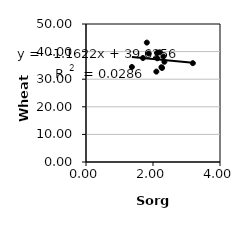
| Category | Series 0 |
|---|---|
| 1.37 | 34.428 |
| 1.7 | 37.674 |
| 2.27 | 34.07 |
| 2.1 | 32.748 |
| 2.12 | 39.498 |
| 2.2512 | 34.333 |
| 1.8732 | 39.305 |
| 2.31 | 38.213 |
| 2.128 | 37.575 |
| 3.19 | 35.812 |
| 2.34 | 36.314 |
| 2.2 | 39.74 |
| 1.8153884429 | 43.265 |